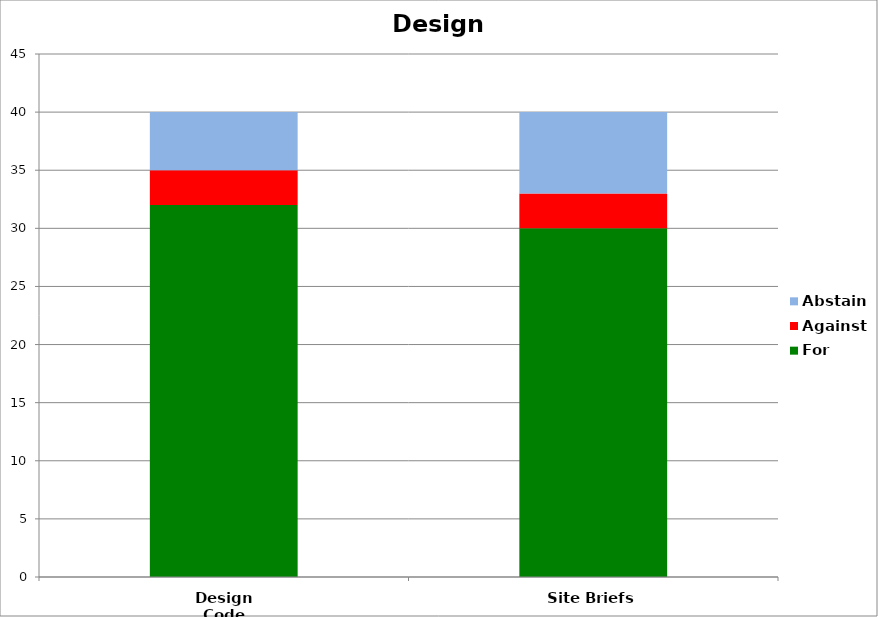
| Category | For | Against | Abstain |
|---|---|---|---|
| Design Code | 32 | 3 | 5 |
| Site Briefs | 30 | 3 | 7 |